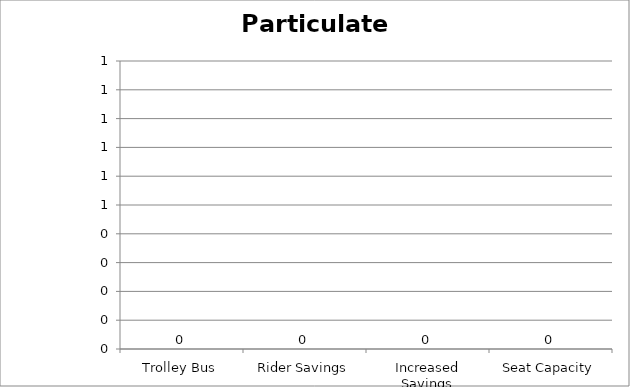
| Category | Particulate Matter |
|---|---|
| Trolley Bus | 0 |
| Rider Savings | 0 |
| Increased Savings | 0 |
| Seat Capacity | 0 |